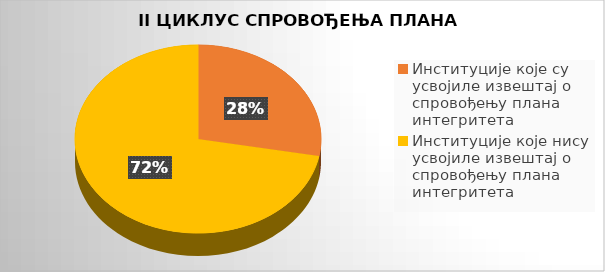
| Category | Series 0 |
|---|---|
| Институције које су усвојиле извештај о спровођењу плана интегритета | 0.276 |
| Институције које нису усвојиле извештај о спровођењу плана интегритета | 0.714 |